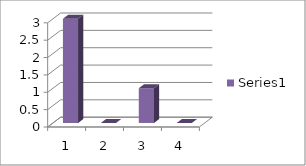
| Category | Series 0 |
|---|---|
| 0 | 3 |
| 1 | 0 |
| 2 | 1 |
| 3 | 0 |